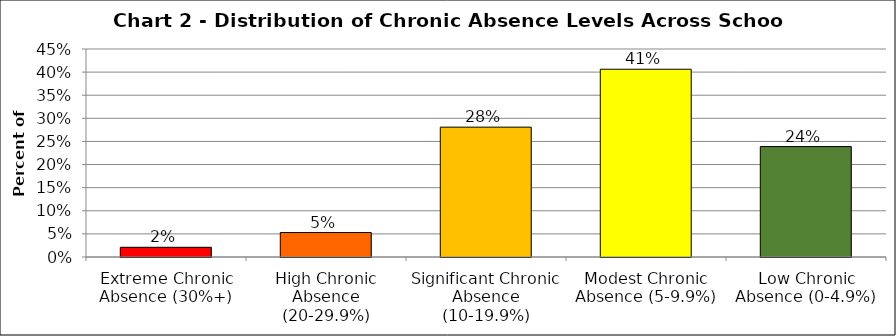
| Category | Series 1 |
|---|---|
| Extreme Chronic Absence (30%+) | 0.021 |
| High Chronic Absence (20-29.9%) | 0.053 |
| Significant Chronic Absence (10-19.9%) | 0.281 |
| Modest Chronic Absence (5-9.9%) | 0.406 |
| Low Chronic Absence (0-4.9%) | 0.239 |